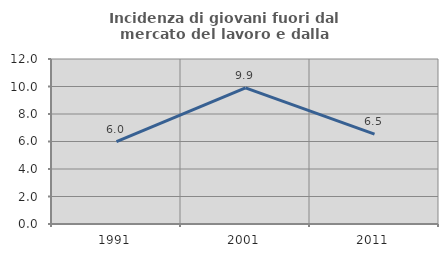
| Category | Incidenza di giovani fuori dal mercato del lavoro e dalla formazione  |
|---|---|
| 1991.0 | 5.991 |
| 2001.0 | 9.896 |
| 2011.0 | 6.536 |